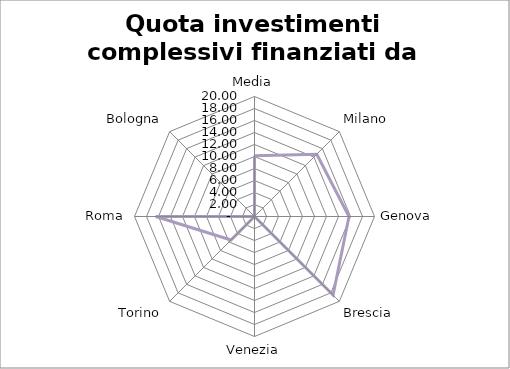
| Category | Quota investimenti complessivi finanziati da debito |
|---|---|
| Media | 10.134 |
| Milano | 14.68 |
| Genova | 15.75 |
| Brescia | 18.52 |
| Venezia | 0 |
| Torino | 5.54 |
| Roma | 16.45 |
| Bologna | 0 |